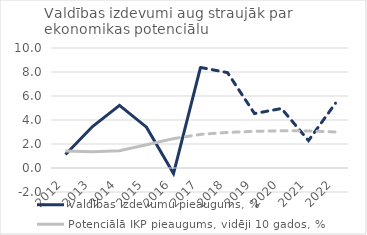
| Category | Valdības izdevumu pieaugums, % | Potenciālā IKP pieaugums, vidēji 10 gados, % |
|---|---|---|
| 2012 | 1.127 | 1.41 |
| 2013 | 3.456 | 1.359 |
| 2014 | 5.221 | 1.439 |
| 2015 | 3.403 | 1.938 |
| 2016 | -0.463 | 2.446 |
| 2017 | 8.379 | 2.802 |
| 2018 | 7.948 | 2.966 |
| 2019 | 4.537 | 3.055 |
| 2020 | 4.957 | 3.1 |
| 2021 | 2.282 | 3.091 |
| 2022 | 5.4 | 3 |